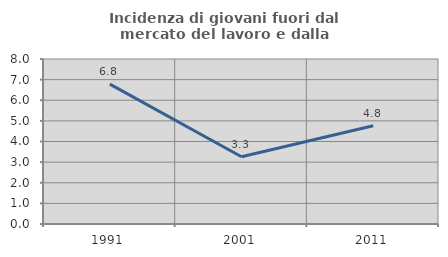
| Category | Incidenza di giovani fuori dal mercato del lavoro e dalla formazione  |
|---|---|
| 1991.0 | 6.78 |
| 2001.0 | 3.261 |
| 2011.0 | 4.762 |